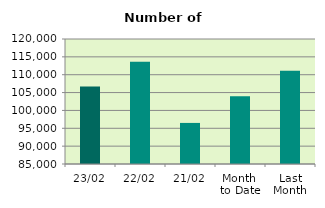
| Category | Series 0 |
|---|---|
| 23/02 | 106688 |
| 22/02 | 113604 |
| 21/02 | 96500 |
| Month 
to Date | 103988.824 |
| Last
Month | 111077.545 |